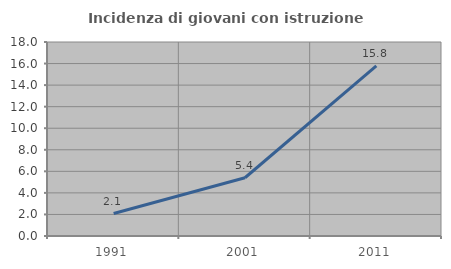
| Category | Incidenza di giovani con istruzione universitaria |
|---|---|
| 1991.0 | 2.083 |
| 2001.0 | 5.405 |
| 2011.0 | 15.789 |